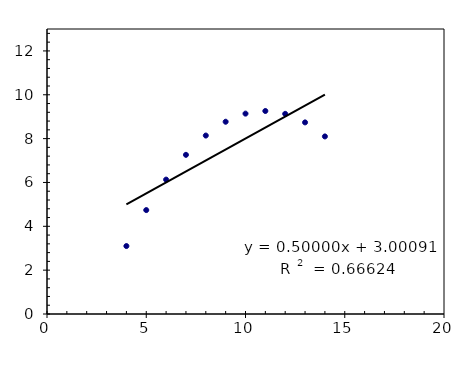
| Category | Series 0 |
|---|---|
| 4.0 | 3.1 |
| 5.0 | 4.74 |
| 6.0 | 6.13 |
| 7.0 | 7.26 |
| 8.0 | 8.14 |
| 9.0 | 8.77 |
| 10.0 | 9.14 |
| 11.0 | 9.26 |
| 12.0 | 9.13 |
| 13.0 | 8.74 |
| 14.0 | 8.1 |